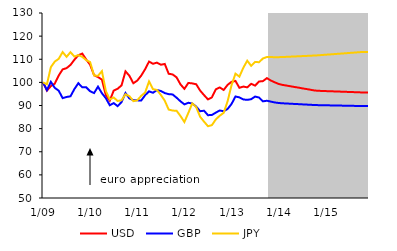
| Category | USD | GBP | JPY |
|---|---|---|---|
|  1/09 | 100 | 100 | 100 |
| 2 | 96.444 | 96.662 | 99.176 |
| 3 | 98.368 | 100.216 | 106.601 |
| 4 | 99.477 | 97.629 | 108.987 |
| 5 | 102.973 | 96.405 | 110.183 |
| 6 | 105.616 | 93.202 | 113.108 |
| 7 | 106.156 | 93.68 | 111.048 |
| 8 | 107.539 | 93.982 | 113.051 |
| 9 | 109.799 | 97.137 | 111.168 |
| 10 | 111.74 | 99.637 | 111.788 |
| 11 | 112.455 | 97.855 | 111.036 |
| 12 | 109.878 | 97.863 | 109.601 |
|  1/10 | 107.602 | 96.159 | 108.761 |
| 2 | 103.119 | 95.379 | 102.987 |
| 3 | 102.3 | 98.147 | 102.837 |
| 4 | 101.2 | 95.306 | 104.85 |
| 5 | 94.508 | 93.159 | 96.277 |
| 6 | 92.095 | 90.111 | 92.63 |
| 7 | 96.44 | 91.035 | 93.462 |
| 8 | 97.236 | 89.717 | 91.949 |
| 9 | 98.7 | 91.492 | 92.262 |
| 10 | 104.778 | 95.398 | 94.879 |
| 11 | 102.846 | 93.051 | 94.041 |
| 12 | 99.616 | 92.32 | 91.878 |
|  1/11 | 100.778 | 92.231 | 92.259 |
| 2 | 102.914 | 92.144 | 94.158 |
| 3 | 105.685 | 94.457 | 95.605 |
| 4 | 108.997 | 96.113 | 100.402 |
| 5 | 108.041 | 95.506 | 97.08 |
| 6 | 108.536 | 96.676 | 96.712 |
| 7 | 107.631 | 96.287 | 94.582 |
| 8 | 107.97 | 95.37 | 92.062 |
| 9 | 103.727 | 94.912 | 88.251 |
| 10 | 103.431 | 94.774 | 87.805 |
| 11 | 102.185 | 93.38 | 87.735 |
| 12 | 99.143 | 91.823 | 85.458 |
|  1/12 | 97.191 | 90.488 | 82.855 |
| 2 | 99.764 | 91.175 | 86.782 |
| 3 | 99.558 | 90.872 | 90.901 |
| 4 | 99.191 | 89.546 | 89.314 |
| 5 | 96.471 | 87.528 | 85.154 |
| 6 | 94.493 | 87.745 | 83.025 |
| 7 | 92.625 | 85.811 | 81.036 |
| 8 | 93.516 | 85.9 | 81.507 |
| 9 | 97.015 | 86.932 | 83.977 |
| 10 | 97.807 | 87.847 | 85.583 |
| 11 | 96.721 | 87.514 | 86.825 |
| 12 | 98.926 | 88.499 | 91.857 |
|  1/13 | 100.228 | 90.653 | 98.766 |
| 2 | 100.633 | 93.901 | 103.768 |
| 3 | 97.651 | 93.512 | 102.482 |
| 4 | 98.192 | 92.613 | 106.326 |
| 5 | 97.847 | 92.44 | 109.37 |
| 6 | 99.383 | 92.73 | 107.144 |
| 7 | 98.598 | 93.854 | 108.862 |
| 8 | 100.37 | 93.462 | 108.705 |
| 9 | 100.545 | 91.796 | 110.349 |
| 10 | 101.832 | 92.056 | 110.955 |
| 11 | 100.804 | 91.69 | 110.998 |
| 12 | 100.029 | 91.32 | 110.83 |
|  1/14 | 99.315 | 91.085 | 110.903 |
| 2 | 98.895 | 90.95 | 110.968 |
| 3 | 98.617 | 90.863 | 111.042 |
| 4 | 98.32 | 90.771 | 111.122 |
| 5 | 98.015 | 90.677 | 111.204 |
| 6 | 97.745 | 90.593 | 111.276 |
| 7 | 97.42 | 90.492 | 111.364 |
| 8 | 97.143 | 90.406 | 111.438 |
| 9 | 96.852 | 90.316 | 111.516 |
| 10 | 96.52 | 90.213 | 111.605 |
| 11 | 96.363 | 90.159 | 111.692 |
| 12 | 96.292 | 90.121 | 111.83 |
|  1/15 | 96.225 | 90.084 | 111.966 |
| 2 | 96.17 | 90.054 | 112.078 |
| 3 | 96.107 | 90.019 | 112.207 |
| 4 | 96.041 | 89.983 | 112.34 |
| 5 | 95.982 | 89.95 | 112.461 |
| 6 | 95.92 | 89.916 | 112.588 |
| 7 | 95.85 | 89.878 | 112.729 |
| 8 | 95.791 | 89.845 | 112.85 |
| 9 | 95.727 | 89.81 | 112.98 |
| 10 | 95.662 | 89.774 | 113.112 |
| 11 | 95.631 | 89.757 | 113.173 |
| 12 | 95.631 | 89.757 | 113.174 |